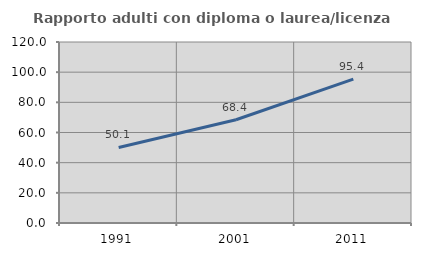
| Category | Rapporto adulti con diploma o laurea/licenza media  |
|---|---|
| 1991.0 | 50.084 |
| 2001.0 | 68.444 |
| 2011.0 | 95.377 |